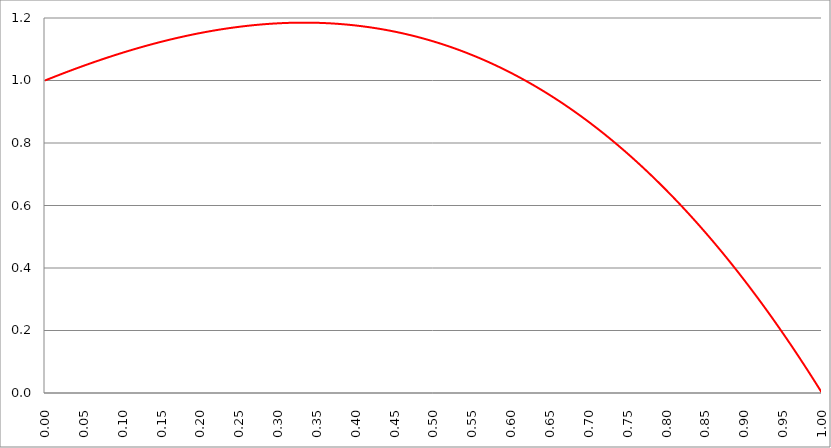
| Category | Series 1 | Series 0 | Series 2 |
|---|---|---|---|
| 0.0 | 1 |  |  |
| 0.0005 | 1 |  |  |
| 0.001 | 1.001 |  |  |
| 0.0015 | 1.001 |  |  |
| 0.002 | 1.002 |  |  |
| 0.0025 | 1.002 |  |  |
| 0.003 | 1.003 |  |  |
| 0.0035 | 1.003 |  |  |
| 0.004 | 1.004 |  |  |
| 0.0045 | 1.004 |  |  |
| 0.005 | 1.005 |  |  |
| 0.0055 | 1.005 |  |  |
| 0.006 | 1.006 |  |  |
| 0.0065 | 1.006 |  |  |
| 0.007 | 1.007 |  |  |
| 0.0075 | 1.007 |  |  |
| 0.008 | 1.008 |  |  |
| 0.0085 | 1.008 |  |  |
| 0.009 | 1.009 |  |  |
| 0.0095 | 1.009 |  |  |
| 0.01 | 1.01 |  |  |
| 0.0105 | 1.01 |  |  |
| 0.011 | 1.011 |  |  |
| 0.0115 | 1.011 |  |  |
| 0.012 | 1.012 |  |  |
| 0.0125 | 1.012 |  |  |
| 0.013 | 1.013 |  |  |
| 0.0135 | 1.013 |  |  |
| 0.014 | 1.014 |  |  |
| 0.0145 | 1.014 |  |  |
| 0.015 | 1.015 |  |  |
| 0.0155 | 1.015 |  |  |
| 0.016 | 1.016 |  |  |
| 0.0165 | 1.016 |  |  |
| 0.017 | 1.017 |  |  |
| 0.0175 | 1.017 |  |  |
| 0.018 | 1.018 |  |  |
| 0.0185 | 1.018 |  |  |
| 0.019 | 1.019 |  |  |
| 0.0195 | 1.019 |  |  |
| 0.02 | 1.02 |  |  |
| 0.0205 | 1.02 |  |  |
| 0.021 | 1.021 |  |  |
| 0.0215 | 1.021 |  |  |
| 0.022 | 1.022 |  |  |
| 0.0225 | 1.022 |  |  |
| 0.023 | 1.022 |  |  |
| 0.0235 | 1.023 |  |  |
| 0.024 | 1.023 |  |  |
| 0.0245 | 1.024 |  |  |
| 0.025 | 1.024 |  |  |
| 0.0255 | 1.025 |  |  |
| 0.026 | 1.025 |  |  |
| 0.0265 | 1.026 |  |  |
| 0.027 | 1.026 |  |  |
| 0.0275 | 1.027 |  |  |
| 0.028 | 1.027 |  |  |
| 0.0285 | 1.028 |  |  |
| 0.029 | 1.028 |  |  |
| 0.0295 | 1.029 |  |  |
| 0.03 | 1.029 |  |  |
| 0.0305 | 1.03 |  |  |
| 0.031 | 1.03 |  |  |
| 0.0315 | 1.03 |  |  |
| 0.032 | 1.031 |  |  |
| 0.0325 | 1.031 |  |  |
| 0.033 | 1.032 |  |  |
| 0.0335 | 1.032 |  |  |
| 0.034 | 1.033 |  |  |
| 0.0345 | 1.033 |  |  |
| 0.035 | 1.034 |  |  |
| 0.0355 | 1.034 |  |  |
| 0.036 | 1.035 |  |  |
| 0.0365 | 1.035 |  |  |
| 0.037 | 1.036 |  |  |
| 0.0375 | 1.036 |  |  |
| 0.038 | 1.037 |  |  |
| 0.0385 | 1.037 |  |  |
| 0.039 | 1.037 |  |  |
| 0.0395 | 1.038 |  |  |
| 0.04 | 1.038 |  |  |
| 0.0405 | 1.039 |  |  |
| 0.041 | 1.039 |  |  |
| 0.0415 | 1.04 |  |  |
| 0.042 | 1.04 |  |  |
| 0.0425 | 1.041 |  |  |
| 0.043 | 1.041 |  |  |
| 0.0435 | 1.042 |  |  |
| 0.044 | 1.042 |  |  |
| 0.0445 | 1.042 |  |  |
| 0.045 | 1.043 |  |  |
| 0.0455 | 1.043 |  |  |
| 0.046 | 1.044 |  |  |
| 0.0465 | 1.044 |  |  |
| 0.047 | 1.045 |  |  |
| 0.0475 | 1.045 |  |  |
| 0.048 | 1.046 |  |  |
| 0.0485 | 1.046 |  |  |
| 0.049 | 1.046 |  |  |
| 0.0495 | 1.047 |  |  |
| 0.05 | 1.047 |  |  |
| 0.0505 | 1.048 |  |  |
| 0.051 | 1.048 |  |  |
| 0.0515 | 1.049 |  |  |
| 0.052 | 1.049 |  |  |
| 0.0525 | 1.05 |  |  |
| 0.053 | 1.05 |  |  |
| 0.0535 | 1.05 |  |  |
| 0.054 | 1.051 |  |  |
| 0.0545 | 1.051 |  |  |
| 0.055 | 1.052 |  |  |
| 0.0555 | 1.052 |  |  |
| 0.056 | 1.053 |  |  |
| 0.0565 | 1.053 |  |  |
| 0.057 | 1.054 |  |  |
| 0.0575 | 1.054 |  |  |
| 0.058 | 1.054 |  |  |
| 0.0585 | 1.055 |  |  |
| 0.059 | 1.055 |  |  |
| 0.0595 | 1.056 |  |  |
| 0.06 | 1.056 |  |  |
| 0.0605 | 1.057 |  |  |
| 0.061 | 1.057 |  |  |
| 0.0615 | 1.057 |  |  |
| 0.062 | 1.058 |  |  |
| 0.0625 | 1.058 |  |  |
| 0.063 | 1.059 |  |  |
| 0.0635 | 1.059 |  |  |
| 0.064 | 1.06 |  |  |
| 0.0645 | 1.06 |  |  |
| 0.065 | 1.061 |  |  |
| 0.0655 | 1.061 |  |  |
| 0.066 | 1.061 |  |  |
| 0.0665 | 1.062 |  |  |
| 0.067 | 1.062 |  |  |
| 0.0675 | 1.063 |  |  |
| 0.068 | 1.063 |  |  |
| 0.0685 | 1.063 |  |  |
| 0.069 | 1.064 |  |  |
| 0.0695 | 1.064 |  |  |
| 0.07 | 1.065 |  |  |
| 0.0705 | 1.065 |  |  |
| 0.071 | 1.066 |  |  |
| 0.0715 | 1.066 |  |  |
| 0.072 | 1.066 |  |  |
| 0.0725 | 1.067 |  |  |
| 0.073 | 1.067 |  |  |
| 0.0735 | 1.068 |  |  |
| 0.074 | 1.068 |  |  |
| 0.0745 | 1.069 |  |  |
| 0.075 | 1.069 |  |  |
| 0.0755 | 1.069 |  |  |
| 0.076 | 1.07 |  |  |
| 0.0765 | 1.07 |  |  |
| 0.077 | 1.071 |  |  |
| 0.0775 | 1.071 |  |  |
| 0.078 | 1.071 |  |  |
| 0.0785 | 1.072 |  |  |
| 0.079 | 1.072 |  |  |
| 0.0795 | 1.073 |  |  |
| 0.08 | 1.073 |  |  |
| 0.0805 | 1.073 |  |  |
| 0.081 | 1.074 |  |  |
| 0.0815 | 1.074 |  |  |
| 0.082 | 1.075 |  |  |
| 0.0825 | 1.075 |  |  |
| 0.083 | 1.076 |  |  |
| 0.0835 | 1.076 |  |  |
| 0.084 | 1.076 |  |  |
| 0.0845 | 1.077 |  |  |
| 0.085 | 1.077 |  |  |
| 0.0855 | 1.078 |  |  |
| 0.086 | 1.078 |  |  |
| 0.0865 | 1.078 |  |  |
| 0.087 | 1.079 |  |  |
| 0.0875 | 1.079 |  |  |
| 0.088 | 1.08 |  |  |
| 0.0885 | 1.08 |  |  |
| 0.089 | 1.08 |  |  |
| 0.0895 | 1.081 |  |  |
| 0.09 | 1.081 |  |  |
| 0.0905 | 1.082 |  |  |
| 0.091 | 1.082 |  |  |
| 0.0915 | 1.082 |  |  |
| 0.092 | 1.083 |  |  |
| 0.0925 | 1.083 |  |  |
| 0.093 | 1.084 |  |  |
| 0.0935 | 1.084 |  |  |
| 0.094 | 1.084 |  |  |
| 0.0945 | 1.085 |  |  |
| 0.095 | 1.085 |  |  |
| 0.0955 | 1.086 |  |  |
| 0.096 | 1.086 |  |  |
| 0.0965 | 1.086 |  |  |
| 0.097 | 1.087 |  |  |
| 0.0975 | 1.087 |  |  |
| 0.098 | 1.087 |  |  |
| 0.0985 | 1.088 |  |  |
| 0.099 | 1.088 |  |  |
| 0.0995 | 1.089 |  |  |
| 0.1 | 1.089 |  |  |
| 0.1005 | 1.089 |  |  |
| 0.101 | 1.09 |  |  |
| 0.1015 | 1.09 |  |  |
| 0.102 | 1.091 |  |  |
| 0.1025 | 1.091 |  |  |
| 0.103 | 1.091 |  |  |
| 0.1035 | 1.092 |  |  |
| 0.104 | 1.092 |  |  |
| 0.1045 | 1.092 |  |  |
| 0.105 | 1.093 |  |  |
| 0.1055 | 1.093 |  |  |
| 0.106 | 1.094 |  |  |
| 0.1065 | 1.094 |  |  |
| 0.107 | 1.094 |  |  |
| 0.1075 | 1.095 |  |  |
| 0.108 | 1.095 |  |  |
| 0.1085 | 1.095 |  |  |
| 0.109 | 1.096 |  |  |
| 0.1095 | 1.096 |  |  |
| 0.11 | 1.097 |  |  |
| 0.1105 | 1.097 |  |  |
| 0.111 | 1.097 |  |  |
| 0.1115 | 1.098 |  |  |
| 0.112 | 1.098 |  |  |
| 0.1125 | 1.098 |  |  |
| 0.113 | 1.099 |  |  |
| 0.1135 | 1.099 |  |  |
| 0.114 | 1.1 |  |  |
| 0.1145 | 1.1 |  |  |
| 0.115 | 1.1 |  |  |
| 0.1155 | 1.101 |  |  |
| 0.116 | 1.101 |  |  |
| 0.1165 | 1.101 |  |  |
| 0.117 | 1.102 |  |  |
| 0.1175 | 1.102 |  |  |
| 0.118 | 1.102 |  |  |
| 0.1185 | 1.103 |  |  |
| 0.119 | 1.103 |  |  |
| 0.1195 | 1.104 |  |  |
| 0.12 | 1.104 |  |  |
| 0.1205 | 1.104 |  |  |
| 0.121 | 1.105 |  |  |
| 0.1215 | 1.105 |  |  |
| 0.122 | 1.105 |  |  |
| 0.1225 | 1.106 |  |  |
| 0.123 | 1.106 |  |  |
| 0.1235 | 1.106 |  |  |
| 0.124 | 1.107 |  |  |
| 0.1245 | 1.107 |  |  |
| 0.125 | 1.107 |  |  |
| 0.1255 | 1.108 |  |  |
| 0.126 | 1.108 |  |  |
| 0.1265 | 1.108 |  |  |
| 0.127 | 1.109 |  |  |
| 0.1275 | 1.109 |  |  |
| 0.128 | 1.11 |  |  |
| 0.1285 | 1.11 |  |  |
| 0.129 | 1.11 |  |  |
| 0.1295 | 1.111 |  |  |
| 0.13 | 1.111 |  |  |
| 0.1305 | 1.111 |  |  |
| 0.131 | 1.112 |  |  |
| 0.1315 | 1.112 |  |  |
| 0.132 | 1.112 |  |  |
| 0.1325 | 1.113 |  |  |
| 0.133 | 1.113 |  |  |
| 0.1335 | 1.113 |  |  |
| 0.134 | 1.114 |  |  |
| 0.1345 | 1.114 |  |  |
| 0.135 | 1.114 |  |  |
| 0.1355 | 1.115 |  |  |
| 0.136 | 1.115 |  |  |
| 0.1365 | 1.115 |  |  |
| 0.137 | 1.116 |  |  |
| 0.1375 | 1.116 |  |  |
| 0.138 | 1.116 |  |  |
| 0.1385 | 1.117 |  |  |
| 0.139 | 1.117 |  |  |
| 0.1395 | 1.117 |  |  |
| 0.14 | 1.118 |  |  |
| 0.1405 | 1.118 |  |  |
| 0.141 | 1.118 |  |  |
| 0.1415 | 1.119 |  |  |
| 0.142 | 1.119 |  |  |
| 0.1425 | 1.119 |  |  |
| 0.143 | 1.12 |  |  |
| 0.1435 | 1.12 |  |  |
| 0.144 | 1.12 |  |  |
| 0.1445 | 1.121 |  |  |
| 0.145 | 1.121 |  |  |
| 0.1455 | 1.121 |  |  |
| 0.146 | 1.122 |  |  |
| 0.1465 | 1.122 |  |  |
| 0.147 | 1.122 |  |  |
| 0.1475 | 1.123 |  |  |
| 0.148 | 1.123 |  |  |
| 0.1485 | 1.123 |  |  |
| 0.149 | 1.123 |  |  |
| 0.1495 | 1.124 |  |  |
| 0.15 | 1.124 |  |  |
| 0.1505 | 1.124 |  |  |
| 0.151 | 1.125 |  |  |
| 0.1515 | 1.125 |  |  |
| 0.152 | 1.125 |  |  |
| 0.1525 | 1.126 |  |  |
| 0.153 | 1.126 |  |  |
| 0.1535 | 1.126 |  |  |
| 0.154 | 1.127 |  |  |
| 0.1545 | 1.127 |  |  |
| 0.155 | 1.127 |  |  |
| 0.1555 | 1.128 |  |  |
| 0.156 | 1.128 |  |  |
| 0.1565 | 1.128 |  |  |
| 0.157 | 1.128 |  |  |
| 0.1575 | 1.129 |  |  |
| 0.158 | 1.129 |  |  |
| 0.1585 | 1.129 |  |  |
| 0.159 | 1.13 |  |  |
| 0.1595 | 1.13 |  |  |
| 0.16 | 1.13 |  |  |
| 0.1605 | 1.131 |  |  |
| 0.161 | 1.131 |  |  |
| 0.1615 | 1.131 |  |  |
| 0.162 | 1.132 |  |  |
| 0.1625 | 1.132 |  |  |
| 0.163 | 1.132 |  |  |
| 0.1635 | 1.132 |  |  |
| 0.164 | 1.133 |  |  |
| 0.1645 | 1.133 |  |  |
| 0.165 | 1.133 |  |  |
| 0.1655 | 1.134 |  |  |
| 0.166 | 1.134 |  |  |
| 0.1665 | 1.134 |  |  |
| 0.167 | 1.134 |  |  |
| 0.1675 | 1.135 |  |  |
| 0.168 | 1.135 |  |  |
| 0.1685 | 1.135 |  |  |
| 0.169 | 1.136 |  |  |
| 0.1695 | 1.136 |  |  |
| 0.17 | 1.136 |  |  |
| 0.1705 | 1.136 |  |  |
| 0.171 | 1.137 |  |  |
| 0.1715 | 1.137 |  |  |
| 0.172 | 1.137 |  |  |
| 0.1725 | 1.138 |  |  |
| 0.173 | 1.138 |  |  |
| 0.1735 | 1.138 |  |  |
| 0.174 | 1.138 |  |  |
| 0.1745 | 1.139 |  |  |
| 0.175 | 1.139 |  |  |
| 0.1755 | 1.139 |  |  |
| 0.176 | 1.14 |  |  |
| 0.1765 | 1.14 |  |  |
| 0.177 | 1.14 |  |  |
| 0.1775 | 1.14 |  |  |
| 0.178 | 1.141 |  |  |
| 0.1785 | 1.141 |  |  |
| 0.179 | 1.141 |  |  |
| 0.1795 | 1.141 |  |  |
| 0.18 | 1.142 |  |  |
| 0.1805 | 1.142 |  |  |
| 0.181 | 1.142 |  |  |
| 0.1815 | 1.143 |  |  |
| 0.182 | 1.143 |  |  |
| 0.1825 | 1.143 |  |  |
| 0.183 | 1.143 |  |  |
| 0.1835 | 1.144 |  |  |
| 0.184 | 1.144 |  |  |
| 0.1845 | 1.144 |  |  |
| 0.185 | 1.144 |  |  |
| 0.1855 | 1.145 |  |  |
| 0.186 | 1.145 |  |  |
| 0.1865 | 1.145 |  |  |
| 0.187 | 1.145 |  |  |
| 0.1875 | 1.146 |  |  |
| 0.188 | 1.146 |  |  |
| 0.1885 | 1.146 |  |  |
| 0.189 | 1.147 |  |  |
| 0.1895 | 1.147 |  |  |
| 0.19 | 1.147 |  |  |
| 0.1905 | 1.147 |  |  |
| 0.191 | 1.148 |  |  |
| 0.1915 | 1.148 |  |  |
| 0.192 | 1.148 |  |  |
| 0.1925 | 1.148 |  |  |
| 0.193 | 1.149 |  |  |
| 0.1935 | 1.149 |  |  |
| 0.194 | 1.149 |  |  |
| 0.1945 | 1.149 |  |  |
| 0.195 | 1.15 |  |  |
| 0.1955 | 1.15 |  |  |
| 0.196 | 1.15 |  |  |
| 0.1965 | 1.15 |  |  |
| 0.197 | 1.151 |  |  |
| 0.1975 | 1.151 |  |  |
| 0.198 | 1.151 |  |  |
| 0.1985 | 1.151 |  |  |
| 0.199 | 1.152 |  |  |
| 0.1995 | 1.152 |  |  |
| 0.2 | 1.152 |  |  |
| 0.2005 | 1.152 |  |  |
| 0.201 | 1.152 |  |  |
| 0.2015 | 1.153 |  |  |
| 0.202 | 1.153 |  |  |
| 0.2025 | 1.153 |  |  |
| 0.203 | 1.153 |  |  |
| 0.2035 | 1.154 |  |  |
| 0.204 | 1.154 |  |  |
| 0.2045 | 1.154 |  |  |
| 0.205 | 1.154 |  |  |
| 0.2055 | 1.155 |  |  |
| 0.206 | 1.155 |  |  |
| 0.2065 | 1.155 |  |  |
| 0.207 | 1.155 |  |  |
| 0.2075 | 1.156 |  |  |
| 0.208 | 1.156 |  |  |
| 0.2085 | 1.156 |  |  |
| 0.209 | 1.156 |  |  |
| 0.2095 | 1.156 |  |  |
| 0.21 | 1.157 |  |  |
| 0.2105 | 1.157 |  |  |
| 0.211 | 1.157 |  |  |
| 0.2115 | 1.157 |  |  |
| 0.212 | 1.158 |  |  |
| 0.2125 | 1.158 |  |  |
| 0.213 | 1.158 |  |  |
| 0.2135 | 1.158 |  |  |
| 0.214 | 1.158 |  |  |
| 0.2145 | 1.159 |  |  |
| 0.215 | 1.159 |  |  |
| 0.2155 | 1.159 |  |  |
| 0.216 | 1.159 |  |  |
| 0.2165 | 1.159 |  |  |
| 0.217 | 1.16 |  |  |
| 0.2175 | 1.16 |  |  |
| 0.218 | 1.16 |  |  |
| 0.2185 | 1.16 |  |  |
| 0.219 | 1.161 |  |  |
| 0.2195 | 1.161 |  |  |
| 0.22 | 1.161 |  |  |
| 0.2205 | 1.161 |  |  |
| 0.221 | 1.161 |  |  |
| 0.2215 | 1.162 |  |  |
| 0.222 | 1.162 |  |  |
| 0.2225 | 1.162 |  |  |
| 0.223 | 1.162 |  |  |
| 0.2235 | 1.162 |  |  |
| 0.224 | 1.163 |  |  |
| 0.2245 | 1.163 |  |  |
| 0.225 | 1.163 |  |  |
| 0.2255 | 1.163 |  |  |
| 0.226 | 1.163 |  |  |
| 0.2265 | 1.164 |  |  |
| 0.227 | 1.164 |  |  |
| 0.2275 | 1.164 |  |  |
| 0.228 | 1.164 |  |  |
| 0.2285 | 1.164 |  |  |
| 0.229 | 1.165 |  |  |
| 0.2295 | 1.165 |  |  |
| 0.23 | 1.165 |  |  |
| 0.2305 | 1.165 |  |  |
| 0.231 | 1.165 |  |  |
| 0.2315 | 1.166 |  |  |
| 0.232 | 1.166 |  |  |
| 0.2325 | 1.166 |  |  |
| 0.233 | 1.166 |  |  |
| 0.2335 | 1.166 |  |  |
| 0.234 | 1.166 |  |  |
| 0.2345 | 1.167 |  |  |
| 0.235 | 1.167 |  |  |
| 0.2355 | 1.167 |  |  |
| 0.236 | 1.167 |  |  |
| 0.2365 | 1.167 |  |  |
| 0.237 | 1.168 |  |  |
| 0.2375 | 1.168 |  |  |
| 0.238 | 1.168 |  |  |
| 0.2385 | 1.168 |  |  |
| 0.239 | 1.168 |  |  |
| 0.2395 | 1.168 |  |  |
| 0.24 | 1.169 |  |  |
| 0.2405 | 1.169 |  |  |
| 0.241 | 1.169 |  |  |
| 0.2415 | 1.169 |  |  |
| 0.242 | 1.169 |  |  |
| 0.2425 | 1.169 |  |  |
| 0.243 | 1.17 |  |  |
| 0.2435 | 1.17 |  |  |
| 0.244 | 1.17 |  |  |
| 0.2445 | 1.17 |  |  |
| 0.245 | 1.17 |  |  |
| 0.2455 | 1.17 |  |  |
| 0.246 | 1.171 |  |  |
| 0.2465 | 1.171 |  |  |
| 0.247 | 1.171 |  |  |
| 0.2475 | 1.171 |  |  |
| 0.248 | 1.171 |  |  |
| 0.2485 | 1.171 |  |  |
| 0.249 | 1.172 |  |  |
| 0.2495 | 1.172 |  |  |
| 0.25 | 1.172 |  |  |
| 0.2505 | 1.172 |  |  |
| 0.251 | 1.172 |  |  |
| 0.2515 | 1.172 |  |  |
| 0.252 | 1.172 |  |  |
| 0.2525 | 1.173 |  |  |
| 0.253 | 1.173 |  |  |
| 0.2535 | 1.173 |  |  |
| 0.254 | 1.173 |  |  |
| 0.2545 | 1.173 |  |  |
| 0.255 | 1.173 |  |  |
| 0.2555 | 1.174 |  |  |
| 0.256 | 1.174 |  |  |
| 0.2565 | 1.174 |  |  |
| 0.257 | 1.174 |  |  |
| 0.2575 | 1.174 |  |  |
| 0.258 | 1.174 |  |  |
| 0.2585 | 1.174 |  |  |
| 0.259 | 1.175 |  |  |
| 0.2595 | 1.175 |  |  |
| 0.26 | 1.175 |  |  |
| 0.2605 | 1.175 |  |  |
| 0.261 | 1.175 |  |  |
| 0.2615 | 1.175 |  |  |
| 0.262 | 1.175 |  |  |
| 0.2625 | 1.176 |  |  |
| 0.263 | 1.176 |  |  |
| 0.2635 | 1.176 |  |  |
| 0.264 | 1.176 |  |  |
| 0.2645 | 1.176 |  |  |
| 0.265 | 1.176 |  |  |
| 0.2655 | 1.176 |  |  |
| 0.266 | 1.176 |  |  |
| 0.2665 | 1.177 |  |  |
| 0.267 | 1.177 |  |  |
| 0.2675 | 1.177 |  |  |
| 0.268 | 1.177 |  |  |
| 0.2685 | 1.177 |  |  |
| 0.269 | 1.177 |  |  |
| 0.2695 | 1.177 |  |  |
| 0.27 | 1.177 |  |  |
| 0.2705 | 1.178 |  |  |
| 0.271 | 1.178 |  |  |
| 0.2715 | 1.178 |  |  |
| 0.272 | 1.178 |  |  |
| 0.2725 | 1.178 |  |  |
| 0.273 | 1.178 |  |  |
| 0.2735 | 1.178 |  |  |
| 0.274 | 1.178 |  |  |
| 0.2745 | 1.178 |  |  |
| 0.275 | 1.179 |  |  |
| 0.2755 | 1.179 |  |  |
| 0.276 | 1.179 |  |  |
| 0.2765 | 1.179 |  |  |
| 0.277 | 1.179 |  |  |
| 0.2775 | 1.179 |  |  |
| 0.278 | 1.179 |  |  |
| 0.2785 | 1.179 |  |  |
| 0.279 | 1.179 |  |  |
| 0.2795 | 1.18 |  |  |
| 0.28 | 1.18 |  |  |
| 0.2805 | 1.18 |  |  |
| 0.281 | 1.18 |  |  |
| 0.2815 | 1.18 |  |  |
| 0.282 | 1.18 |  |  |
| 0.2825 | 1.18 |  |  |
| 0.283 | 1.18 |  |  |
| 0.2835 | 1.18 |  |  |
| 0.284 | 1.18 |  |  |
| 0.2845 | 1.181 |  |  |
| 0.285 | 1.181 |  |  |
| 0.2855 | 1.181 |  |  |
| 0.286 | 1.181 |  |  |
| 0.2865 | 1.181 |  |  |
| 0.287 | 1.181 |  |  |
| 0.2875 | 1.181 |  |  |
| 0.288 | 1.181 |  |  |
| 0.2885 | 1.181 |  |  |
| 0.289 | 1.181 |  |  |
| 0.2895 | 1.181 |  |  |
| 0.29 | 1.182 |  |  |
| 0.2905 | 1.182 |  |  |
| 0.291 | 1.182 |  |  |
| 0.2915 | 1.182 |  |  |
| 0.292 | 1.182 |  |  |
| 0.2925 | 1.182 |  |  |
| 0.293 | 1.182 |  |  |
| 0.2935 | 1.182 |  |  |
| 0.294 | 1.182 |  |  |
| 0.2945 | 1.182 |  |  |
| 0.295 | 1.182 |  |  |
| 0.2955 | 1.182 |  |  |
| 0.296 | 1.182 |  |  |
| 0.2965 | 1.183 |  |  |
| 0.297 | 1.183 |  |  |
| 0.2975 | 1.183 |  |  |
| 0.298 | 1.183 |  |  |
| 0.2985 | 1.183 |  |  |
| 0.299 | 1.183 |  |  |
| 0.2995 | 1.183 |  |  |
| 0.3 | 1.183 |  |  |
| 0.3005 | 1.183 |  |  |
| 0.301 | 1.183 |  |  |
| 0.3015 | 1.183 |  |  |
| 0.302 | 1.183 |  |  |
| 0.3025 | 1.183 |  |  |
| 0.303 | 1.183 |  |  |
| 0.3035 | 1.183 |  |  |
| 0.304 | 1.183 |  |  |
| 0.3045 | 1.184 |  |  |
| 0.305 | 1.184 |  |  |
| 0.3055 | 1.184 |  |  |
| 0.306 | 1.184 |  |  |
| 0.3065 | 1.184 |  |  |
| 0.307 | 1.184 |  |  |
| 0.3075 | 1.184 |  |  |
| 0.308 | 1.184 |  |  |
| 0.3085 | 1.184 |  |  |
| 0.309 | 1.184 |  |  |
| 0.3095 | 1.184 |  |  |
| 0.31 | 1.184 |  |  |
| 0.3105 | 1.184 |  |  |
| 0.311 | 1.184 |  |  |
| 0.3115 | 1.184 |  |  |
| 0.312 | 1.184 |  |  |
| 0.3125 | 1.184 |  |  |
| 0.313 | 1.184 |  |  |
| 0.3135 | 1.184 |  |  |
| 0.314 | 1.184 |  |  |
| 0.3145 | 1.184 |  |  |
| 0.315 | 1.185 |  |  |
| 0.3155 | 1.185 |  |  |
| 0.316 | 1.185 |  |  |
| 0.3165 | 1.185 |  |  |
| 0.317 | 1.185 |  |  |
| 0.3175 | 1.185 |  |  |
| 0.318 | 1.185 |  |  |
| 0.3185 | 1.185 |  |  |
| 0.319 | 1.185 |  |  |
| 0.3195 | 1.185 |  |  |
| 0.32 | 1.185 |  |  |
| 0.3205 | 1.185 |  |  |
| 0.321 | 1.185 |  |  |
| 0.3215 | 1.185 |  |  |
| 0.322 | 1.185 |  |  |
| 0.3225 | 1.185 |  |  |
| 0.323 | 1.185 |  |  |
| 0.3235 | 1.185 |  |  |
| 0.324 | 1.185 |  |  |
| 0.3245 | 1.185 |  |  |
| 0.325 | 1.185 |  |  |
| 0.3255 | 1.185 |  |  |
| 0.326 | 1.185 |  |  |
| 0.3265 | 1.185 |  |  |
| 0.327 | 1.185 |  |  |
| 0.3275 | 1.185 |  |  |
| 0.328 | 1.185 |  |  |
| 0.3285 | 1.185 |  |  |
| 0.329 | 1.185 |  |  |
| 0.3295 | 1.185 |  |  |
| 0.33 | 1.185 |  |  |
| 0.3305 | 1.185 |  |  |
| 0.331 | 1.185 |  |  |
| 0.3315 | 1.185 |  |  |
| 0.332 | 1.185 |  |  |
| 0.3325 | 1.185 |  |  |
| 0.333 | 1.185 |  |  |
| 0.3335 | 1.185 |  |  |
| 0.334 | 1.185 |  |  |
| 0.3345 | 1.185 |  |  |
| 0.335 | 1.185 |  |  |
| 0.3355 | 1.185 |  |  |
| 0.336 | 1.185 |  |  |
| 0.3365 | 1.185 |  |  |
| 0.337 | 1.185 |  |  |
| 0.3375 | 1.185 |  |  |
| 0.338 | 1.185 |  |  |
| 0.3385 | 1.185 |  |  |
| 0.339 | 1.185 |  |  |
| 0.3395 | 1.185 |  |  |
| 0.34 | 1.185 |  |  |
| 0.3405 | 1.185 |  |  |
| 0.341 | 1.185 |  |  |
| 0.3415 | 1.185 |  |  |
| 0.342 | 1.185 |  |  |
| 0.3425 | 1.185 |  |  |
| 0.343 | 1.185 |  |  |
| 0.3435 | 1.185 |  |  |
| 0.344 | 1.185 |  |  |
| 0.3445 | 1.185 |  |  |
| 0.345 | 1.185 |  |  |
| 0.3455 | 1.185 |  |  |
| 0.346 | 1.185 |  |  |
| 0.3465 | 1.185 |  |  |
| 0.347 | 1.185 |  |  |
| 0.3475 | 1.185 |  |  |
| 0.348 | 1.185 |  |  |
| 0.3485 | 1.185 |  |  |
| 0.349 | 1.185 |  |  |
| 0.3495 | 1.185 |  |  |
| 0.35 | 1.185 |  |  |
| 0.3505 | 1.185 |  |  |
| 0.351 | 1.185 |  |  |
| 0.3515 | 1.185 |  |  |
| 0.352 | 1.184 |  |  |
| 0.3525 | 1.184 |  |  |
| 0.353 | 1.184 |  |  |
| 0.3535 | 1.184 |  |  |
| 0.354 | 1.184 |  |  |
| 0.3545 | 1.184 |  |  |
| 0.355 | 1.184 |  |  |
| 0.3555 | 1.184 |  |  |
| 0.356 | 1.184 |  |  |
| 0.3565 | 1.184 |  |  |
| 0.357 | 1.184 |  |  |
| 0.3575 | 1.184 |  |  |
| 0.358 | 1.184 |  |  |
| 0.3585 | 1.184 |  |  |
| 0.359 | 1.184 |  |  |
| 0.3595 | 1.184 |  |  |
| 0.36 | 1.184 |  |  |
| 0.3605 | 1.184 |  |  |
| 0.361 | 1.184 |  |  |
| 0.3615 | 1.184 |  |  |
| 0.362 | 1.184 |  |  |
| 0.3625 | 1.183 |  |  |
| 0.363 | 1.183 |  |  |
| 0.3635 | 1.183 |  |  |
| 0.364 | 1.183 |  |  |
| 0.3645 | 1.183 |  |  |
| 0.365 | 1.183 |  |  |
| 0.3655 | 1.183 |  |  |
| 0.366 | 1.183 |  |  |
| 0.3665 | 1.183 |  |  |
| 0.367 | 1.183 |  |  |
| 0.3675 | 1.183 |  |  |
| 0.368 | 1.183 |  |  |
| 0.3685 | 1.183 |  |  |
| 0.369 | 1.183 |  |  |
| 0.3695 | 1.183 |  |  |
| 0.37 | 1.182 |  |  |
| 0.3705 | 1.182 |  |  |
| 0.371 | 1.182 |  |  |
| 0.3715 | 1.182 |  |  |
| 0.372 | 1.182 |  |  |
| 0.3725 | 1.182 |  |  |
| 0.373 | 1.182 |  |  |
| 0.3735 | 1.182 |  |  |
| 0.374 | 1.182 |  |  |
| 0.3745 | 1.182 |  |  |
| 0.375 | 1.182 |  |  |
| 0.3755 | 1.182 |  |  |
| 0.376 | 1.181 |  |  |
| 0.3765 | 1.181 |  |  |
| 0.377 | 1.181 |  |  |
| 0.3775 | 1.181 |  |  |
| 0.378 | 1.181 |  |  |
| 0.3785 | 1.181 |  |  |
| 0.379 | 1.181 |  |  |
| 0.3795 | 1.181 |  |  |
| 0.38 | 1.181 |  |  |
| 0.3805 | 1.181 |  |  |
| 0.381 | 1.181 |  |  |
| 0.3815 | 1.18 |  |  |
| 0.382 | 1.18 |  |  |
| 0.3825 | 1.18 |  |  |
| 0.383 | 1.18 |  |  |
| 0.3835 | 1.18 |  |  |
| 0.384 | 1.18 |  |  |
| 0.3845 | 1.18 |  |  |
| 0.385 | 1.18 |  |  |
| 0.3855 | 1.18 |  |  |
| 0.386 | 1.179 |  |  |
| 0.3865 | 1.179 |  |  |
| 0.387 | 1.179 |  |  |
| 0.3875 | 1.179 |  |  |
| 0.388 | 1.179 |  |  |
| 0.3885 | 1.179 |  |  |
| 0.389 | 1.179 |  |  |
| 0.3895 | 1.179 |  |  |
| 0.39 | 1.179 |  |  |
| 0.3905 | 1.178 |  |  |
| 0.391 | 1.178 |  |  |
| 0.3915 | 1.178 |  |  |
| 0.392 | 1.178 |  |  |
| 0.3925 | 1.178 |  |  |
| 0.393 | 1.178 |  |  |
| 0.3935 | 1.178 |  |  |
| 0.394 | 1.178 |  |  |
| 0.3945 | 1.177 |  |  |
| 0.395 | 1.177 |  |  |
| 0.3955 | 1.177 |  |  |
| 0.396 | 1.177 |  |  |
| 0.3965 | 1.177 |  |  |
| 0.397 | 1.177 |  |  |
| 0.3975 | 1.177 |  |  |
| 0.398 | 1.177 |  |  |
| 0.3985 | 1.176 |  |  |
| 0.399 | 1.176 |  |  |
| 0.3995 | 1.176 |  |  |
| 0.4 | 1.176 |  |  |
| 0.4005 | 1.176 |  |  |
| 0.401 | 1.176 |  |  |
| 0.4015 | 1.176 |  |  |
| 0.402 | 1.175 |  |  |
| 0.4025 | 1.175 |  |  |
| 0.403 | 1.175 |  |  |
| 0.4035 | 1.175 |  |  |
| 0.404 | 1.175 |  |  |
| 0.4045 | 1.175 |  |  |
| 0.405 | 1.175 |  |  |
| 0.4055 | 1.174 |  |  |
| 0.406 | 1.174 |  |  |
| 0.4065 | 1.174 |  |  |
| 0.407 | 1.174 |  |  |
| 0.4075 | 1.174 |  |  |
| 0.408 | 1.174 |  |  |
| 0.4085 | 1.173 |  |  |
| 0.409 | 1.173 |  |  |
| 0.4095 | 1.173 |  |  |
| 0.41 | 1.173 |  |  |
| 0.4105 | 1.173 |  |  |
| 0.411 | 1.173 |  |  |
| 0.4115 | 1.172 |  |  |
| 0.412 | 1.172 |  |  |
| 0.4125 | 1.172 |  |  |
| 0.413 | 1.172 |  |  |
| 0.4135 | 1.172 |  |  |
| 0.414 | 1.172 |  |  |
| 0.4145 | 1.171 |  |  |
| 0.415 | 1.171 |  |  |
| 0.4155 | 1.171 |  |  |
| 0.416 | 1.171 |  |  |
| 0.4165 | 1.171 |  |  |
| 0.417 | 1.171 |  |  |
| 0.4175 | 1.17 |  |  |
| 0.418 | 1.17 |  |  |
| 0.4185 | 1.17 |  |  |
| 0.419 | 1.17 |  |  |
| 0.4195 | 1.17 |  |  |
| 0.42 | 1.17 |  |  |
| 0.4205 | 1.169 |  |  |
| 0.421 | 1.169 |  |  |
| 0.4215 | 1.169 |  |  |
| 0.422 | 1.169 |  |  |
| 0.4225 | 1.169 |  |  |
| 0.423 | 1.168 |  |  |
| 0.4235 | 1.168 |  |  |
| 0.424 | 1.168 |  |  |
| 0.4245 | 1.168 |  |  |
| 0.425 | 1.168 |  |  |
| 0.4255 | 1.167 |  |  |
| 0.426 | 1.167 |  |  |
| 0.4265 | 1.167 |  |  |
| 0.427 | 1.167 |  |  |
| 0.4275 | 1.167 |  |  |
| 0.428 | 1.166 |  |  |
| 0.4285 | 1.166 |  |  |
| 0.429 | 1.166 |  |  |
| 0.4295 | 1.166 |  |  |
| 0.43 | 1.166 |  |  |
| 0.4305 | 1.165 |  |  |
| 0.431 | 1.165 |  |  |
| 0.4315 | 1.165 |  |  |
| 0.432 | 1.165 |  |  |
| 0.4325 | 1.165 |  |  |
| 0.433 | 1.164 |  |  |
| 0.4335 | 1.164 |  |  |
| 0.434 | 1.164 |  |  |
| 0.4345 | 1.164 |  |  |
| 0.435 | 1.163 |  |  |
| 0.4355 | 1.163 |  |  |
| 0.436 | 1.163 |  |  |
| 0.4365 | 1.163 |  |  |
| 0.437 | 1.163 |  |  |
| 0.4375 | 1.162 |  |  |
| 0.438 | 1.162 |  |  |
| 0.4385 | 1.162 |  |  |
| 0.439 | 1.162 |  |  |
| 0.4395 | 1.161 |  |  |
| 0.44 | 1.161 |  |  |
| 0.4405 | 1.161 |  |  |
| 0.441 | 1.161 |  |  |
| 0.4415 | 1.161 |  |  |
| 0.442 | 1.16 |  |  |
| 0.4425 | 1.16 |  |  |
| 0.443 | 1.16 |  |  |
| 0.4435 | 1.16 |  |  |
| 0.444 | 1.159 |  |  |
| 0.4445 | 1.159 |  |  |
| 0.445 | 1.159 |  |  |
| 0.4455 | 1.159 |  |  |
| 0.446 | 1.158 |  |  |
| 0.4465 | 1.158 |  |  |
| 0.447 | 1.158 |  |  |
| 0.4475 | 1.158 |  |  |
| 0.448 | 1.157 |  |  |
| 0.4485 | 1.157 |  |  |
| 0.449 | 1.157 |  |  |
| 0.4495 | 1.157 |  |  |
| 0.45 | 1.156 |  |  |
| 0.4505 | 1.156 |  |  |
| 0.451 | 1.156 |  |  |
| 0.4515 | 1.156 |  |  |
| 0.452 | 1.155 |  |  |
| 0.4525 | 1.155 |  |  |
| 0.453 | 1.155 |  |  |
| 0.4535 | 1.155 |  |  |
| 0.454 | 1.154 |  |  |
| 0.4545 | 1.154 |  |  |
| 0.455 | 1.154 |  |  |
| 0.4555 | 1.154 |  |  |
| 0.456 | 1.153 |  |  |
| 0.4565 | 1.153 |  |  |
| 0.457 | 1.153 |  |  |
| 0.4575 | 1.152 |  |  |
| 0.458 | 1.152 |  |  |
| 0.4585 | 1.152 |  |  |
| 0.459 | 1.152 |  |  |
| 0.4595 | 1.151 |  |  |
| 0.46 | 1.151 |  |  |
| 0.4605 | 1.151 |  |  |
| 0.461 | 1.151 |  |  |
| 0.4615 | 1.15 |  |  |
| 0.462 | 1.15 |  |  |
| 0.4625 | 1.15 |  |  |
| 0.463 | 1.149 |  |  |
| 0.4635 | 1.149 |  |  |
| 0.464 | 1.149 |  |  |
| 0.4645 | 1.149 |  |  |
| 0.465 | 1.148 |  |  |
| 0.4655 | 1.148 |  |  |
| 0.466 | 1.148 |  |  |
| 0.4665 | 1.147 |  |  |
| 0.467 | 1.147 |  |  |
| 0.4675 | 1.147 |  |  |
| 0.468 | 1.146 |  |  |
| 0.4685 | 1.146 |  |  |
| 0.469 | 1.146 |  |  |
| 0.4695 | 1.146 |  |  |
| 0.47 | 1.145 |  |  |
| 0.4705 | 1.145 |  |  |
| 0.471 | 1.145 |  |  |
| 0.4715 | 1.144 |  |  |
| 0.472 | 1.144 |  |  |
| 0.4725 | 1.144 |  |  |
| 0.473 | 1.143 |  |  |
| 0.4735 | 1.143 |  |  |
| 0.474 | 1.143 |  |  |
| 0.4745 | 1.143 |  |  |
| 0.475 | 1.142 |  |  |
| 0.4755 | 1.142 |  |  |
| 0.476 | 1.142 |  |  |
| 0.4765 | 1.141 |  |  |
| 0.477 | 1.141 |  |  |
| 0.4775 | 1.141 |  |  |
| 0.478 | 1.14 |  |  |
| 0.4785 | 1.14 |  |  |
| 0.479 | 1.14 |  |  |
| 0.4795 | 1.139 |  |  |
| 0.48 | 1.139 |  |  |
| 0.4805 | 1.139 |  |  |
| 0.481 | 1.138 |  |  |
| 0.4815 | 1.138 |  |  |
| 0.482 | 1.138 |  |  |
| 0.4825 | 1.137 |  |  |
| 0.483 | 1.137 |  |  |
| 0.4835 | 1.137 |  |  |
| 0.484 | 1.136 |  |  |
| 0.4845 | 1.136 |  |  |
| 0.485 | 1.136 |  |  |
| 0.4855 | 1.135 |  |  |
| 0.486 | 1.135 |  |  |
| 0.4865 | 1.135 |  |  |
| 0.487 | 1.134 |  |  |
| 0.4875 | 1.134 |  |  |
| 0.488 | 1.134 |  |  |
| 0.4885 | 1.133 |  |  |
| 0.489 | 1.133 |  |  |
| 0.4895 | 1.133 |  |  |
| 0.49 | 1.132 |  |  |
| 0.4905 | 1.132 |  |  |
| 0.491 | 1.132 |  |  |
| 0.4915 | 1.131 |  |  |
| 0.492 | 1.131 |  |  |
| 0.4925 | 1.13 |  |  |
| 0.493 | 1.13 |  |  |
| 0.4935 | 1.13 |  |  |
| 0.494 | 1.129 |  |  |
| 0.4945 | 1.129 |  |  |
| 0.495 | 1.129 |  |  |
| 0.4955 | 1.128 |  |  |
| 0.496 | 1.128 |  |  |
| 0.4965 | 1.128 |  |  |
| 0.497 | 1.127 |  |  |
| 0.4975 | 1.127 |  |  |
| 0.498 | 1.126 |  |  |
| 0.4985 | 1.126 |  |  |
| 0.499 | 1.126 |  |  |
| 0.4995 | 1.125 |  |  |
| 0.5 | 1.125 |  |  |
| 0.5005 | 1.125 |  |  |
| 0.501 | 1.124 |  |  |
| 0.5015 | 1.124 |  |  |
| 0.502 | 1.123 |  |  |
| 0.5025 | 1.123 |  |  |
| 0.503 | 1.123 |  |  |
| 0.5035 | 1.122 |  |  |
| 0.504 | 1.122 |  |  |
| 0.5045 | 1.122 |  |  |
| 0.505 | 1.121 |  |  |
| 0.5055 | 1.121 |  |  |
| 0.506 | 1.12 |  |  |
| 0.5065 | 1.12 |  |  |
| 0.507 | 1.12 |  |  |
| 0.5075 | 1.119 |  |  |
| 0.507999999999999 | 1.119 |  |  |
| 0.508499999999999 | 1.118 |  |  |
| 0.508999999999999 | 1.118 |  |  |
| 0.509499999999999 | 1.118 |  |  |
| 0.509999999999999 | 1.117 |  |  |
| 0.510499999999999 | 1.117 |  |  |
| 0.510999999999999 | 1.116 |  |  |
| 0.511499999999999 | 1.116 |  |  |
| 0.511999999999999 | 1.116 |  |  |
| 0.512499999999999 | 1.115 |  |  |
| 0.512999999999999 | 1.115 |  |  |
| 0.513499999999999 | 1.114 |  |  |
| 0.513999999999999 | 1.114 |  |  |
| 0.514499999999999 | 1.114 |  |  |
| 0.514999999999999 | 1.113 |  |  |
| 0.515499999999999 | 1.113 |  |  |
| 0.515999999999999 | 1.112 |  |  |
| 0.516499999999999 | 1.112 |  |  |
| 0.516999999999998 | 1.112 |  |  |
| 0.517499999999998 | 1.111 |  |  |
| 0.517999999999998 | 1.111 |  |  |
| 0.518499999999998 | 1.11 |  |  |
| 0.518999999999998 | 1.11 |  |  |
| 0.519499999999998 | 1.109 |  |  |
| 0.519999999999998 | 1.109 |  |  |
| 0.520499999999998 | 1.109 |  |  |
| 0.520999999999998 | 1.108 |  |  |
| 0.521499999999998 | 1.108 |  |  |
| 0.521999999999998 | 1.107 |  |  |
| 0.522499999999998 | 1.107 |  |  |
| 0.522999999999998 | 1.106 |  |  |
| 0.523499999999998 | 1.106 |  |  |
| 0.523999999999998 | 1.106 |  |  |
| 0.524499999999998 | 1.105 |  |  |
| 0.524999999999998 | 1.105 |  |  |
| 0.525499999999998 | 1.104 |  |  |
| 0.525999999999997 | 1.104 |  |  |
| 0.526499999999997 | 1.103 |  |  |
| 0.526999999999997 | 1.103 |  |  |
| 0.527499999999997 | 1.102 |  |  |
| 0.527999999999997 | 1.102 |  |  |
| 0.528499999999997 | 1.102 |  |  |
| 0.528999999999997 | 1.101 |  |  |
| 0.529499999999997 | 1.101 |  |  |
| 0.529999999999997 | 1.1 |  |  |
| 0.530499999999997 | 1.1 |  |  |
| 0.530999999999997 | 1.099 |  |  |
| 0.531499999999997 | 1.099 |  |  |
| 0.531999999999997 | 1.098 |  |  |
| 0.532499999999997 | 1.098 |  |  |
| 0.532999999999997 | 1.097 |  |  |
| 0.533499999999997 | 1.097 |  |  |
| 0.533999999999997 | 1.097 |  |  |
| 0.534499999999997 | 1.096 |  |  |
| 0.534999999999996 | 1.096 |  |  |
| 0.535499999999996 | 1.095 |  |  |
| 0.535999999999996 | 1.095 |  |  |
| 0.536499999999996 | 1.094 |  |  |
| 0.536999999999996 | 1.094 |  |  |
| 0.537499999999996 | 1.093 |  |  |
| 0.537999999999996 | 1.093 |  |  |
| 0.538499999999996 | 1.092 |  |  |
| 0.538999999999996 | 1.092 |  |  |
| 0.539499999999996 | 1.091 |  |  |
| 0.539999999999996 | 1.091 |  |  |
| 0.540499999999996 | 1.09 |  |  |
| 0.540999999999996 | 1.09 |  |  |
| 0.541499999999996 | 1.089 |  |  |
| 0.541999999999996 | 1.089 |  |  |
| 0.542499999999996 | 1.089 |  |  |
| 0.542999999999996 | 1.088 |  |  |
| 0.543499999999996 | 1.088 |  |  |
| 0.543999999999995 | 1.087 |  |  |
| 0.544499999999995 | 1.087 |  |  |
| 0.544999999999995 | 1.086 |  |  |
| 0.545499999999995 | 1.086 |  |  |
| 0.545999999999995 | 1.085 |  |  |
| 0.546499999999995 | 1.085 |  |  |
| 0.546999999999995 | 1.084 |  |  |
| 0.547499999999995 | 1.084 |  |  |
| 0.547999999999995 | 1.083 |  |  |
| 0.548499999999995 | 1.083 |  |  |
| 0.548999999999995 | 1.082 |  |  |
| 0.549499999999995 | 1.082 |  |  |
| 0.549999999999995 | 1.081 |  |  |
| 0.550499999999995 | 1.081 |  |  |
| 0.550999999999995 | 1.08 |  |  |
| 0.551499999999995 | 1.08 |  |  |
| 0.551999999999995 | 1.079 |  |  |
| 0.552499999999995 | 1.079 |  |  |
| 0.552999999999994 | 1.078 |  |  |
| 0.553499999999994 | 1.078 |  |  |
| 0.553999999999994 | 1.077 |  |  |
| 0.554499999999994 | 1.077 |  |  |
| 0.554999999999994 | 1.076 |  |  |
| 0.555499999999994 | 1.076 |  |  |
| 0.555999999999994 | 1.075 |  |  |
| 0.556499999999994 | 1.074 |  |  |
| 0.556999999999994 | 1.074 |  |  |
| 0.557499999999994 | 1.073 |  |  |
| 0.557999999999994 | 1.073 |  |  |
| 0.558499999999994 | 1.072 |  |  |
| 0.558999999999994 | 1.072 |  |  |
| 0.559499999999994 | 1.071 |  |  |
| 0.559999999999994 | 1.071 |  |  |
| 0.560499999999994 | 1.07 |  |  |
| 0.560999999999994 | 1.07 |  |  |
| 0.561499999999994 | 1.069 |  |  |
| 0.561999999999993 | 1.069 |  |  |
| 0.562499999999993 | 1.068 |  |  |
| 0.562999999999993 | 1.068 |  |  |
| 0.563499999999993 | 1.067 |  |  |
| 0.563999999999993 | 1.066 |  |  |
| 0.564499999999993 | 1.066 |  |  |
| 0.564999999999993 | 1.065 |  |  |
| 0.565499999999993 | 1.065 |  |  |
| 0.565999999999993 | 1.064 |  |  |
| 0.566499999999993 | 1.064 |  |  |
| 0.566999999999993 | 1.063 |  |  |
| 0.567499999999993 | 1.063 |  |  |
| 0.567999999999993 | 1.062 |  |  |
| 0.568499999999993 | 1.062 |  |  |
| 0.568999999999993 | 1.061 |  |  |
| 0.569499999999993 | 1.06 |  |  |
| 0.569999999999993 | 1.06 |  |  |
| 0.570499999999993 | 1.059 |  |  |
| 0.570999999999993 | 1.059 |  |  |
| 0.571499999999992 | 1.058 |  |  |
| 0.571999999999992 | 1.058 |  |  |
| 0.572499999999992 | 1.057 |  |  |
| 0.572999999999992 | 1.057 |  |  |
| 0.573499999999992 | 1.056 |  |  |
| 0.573999999999992 | 1.055 |  |  |
| 0.574499999999992 | 1.055 |  |  |
| 0.574999999999992 | 1.054 |  |  |
| 0.575499999999992 | 1.054 |  |  |
| 0.575999999999992 | 1.053 |  |  |
| 0.576499999999992 | 1.053 |  |  |
| 0.576999999999992 | 1.052 |  |  |
| 0.577499999999992 | 1.051 |  |  |
| 0.577999999999992 | 1.051 |  |  |
| 0.578499999999992 | 1.05 |  |  |
| 0.578999999999992 | 1.05 |  |  |
| 0.579499999999992 | 1.049 |  |  |
| 0.579999999999992 | 1.048 |  |  |
| 0.580499999999991 | 1.048 |  |  |
| 0.580999999999991 | 1.047 |  |  |
| 0.581499999999991 | 1.047 |  |  |
| 0.581999999999991 | 1.046 |  |  |
| 0.582499999999991 | 1.046 |  |  |
| 0.582999999999991 | 1.045 |  |  |
| 0.583499999999991 | 1.044 |  |  |
| 0.583999999999991 | 1.044 |  |  |
| 0.584499999999991 | 1.043 |  |  |
| 0.584999999999991 | 1.043 |  |  |
| 0.585499999999991 | 1.042 |  |  |
| 0.585999999999991 | 1.041 |  |  |
| 0.586499999999991 | 1.041 |  |  |
| 0.586999999999991 | 1.04 |  |  |
| 0.587499999999991 | 1.04 |  |  |
| 0.587999999999991 | 1.039 |  |  |
| 0.588499999999991 | 1.038 |  |  |
| 0.588999999999991 | 1.038 |  |  |
| 0.58949999999999 | 1.037 |  |  |
| 0.58999999999999 | 1.037 |  |  |
| 0.59049999999999 | 1.036 |  |  |
| 0.59099999999999 | 1.035 |  |  |
| 0.59149999999999 | 1.035 |  |  |
| 0.59199999999999 | 1.034 |  |  |
| 0.59249999999999 | 1.033 |  |  |
| 0.59299999999999 | 1.033 |  |  |
| 0.59349999999999 | 1.032 |  |  |
| 0.59399999999999 | 1.032 |  |  |
| 0.59449999999999 | 1.031 |  |  |
| 0.59499999999999 | 1.03 |  |  |
| 0.59549999999999 | 1.03 |  |  |
| 0.59599999999999 | 1.029 |  |  |
| 0.59649999999999 | 1.028 |  |  |
| 0.59699999999999 | 1.028 |  |  |
| 0.59749999999999 | 1.027 |  |  |
| 0.59799999999999 | 1.027 |  |  |
| 0.598499999999989 | 1.026 |  |  |
| 0.598999999999989 | 1.025 |  |  |
| 0.599499999999989 | 1.025 |  |  |
| 0.599999999999989 | 1.024 |  |  |
| 0.600499999999989 | 1.023 |  |  |
| 0.600999999999989 | 1.023 |  |  |
| 0.601499999999989 | 1.022 |  |  |
| 0.601999999999989 | 1.021 |  |  |
| 0.602499999999989 | 1.021 |  |  |
| 0.602999999999989 | 1.02 |  |  |
| 0.603499999999989 | 1.019 |  |  |
| 0.603999999999989 | 1.019 |  |  |
| 0.604499999999989 | 1.018 |  |  |
| 0.604999999999989 | 1.018 |  |  |
| 0.605499999999989 | 1.017 |  |  |
| 0.605999999999989 | 1.016 |  |  |
| 0.606499999999989 | 1.016 |  |  |
| 0.606999999999988 | 1.015 |  |  |
| 0.607499999999988 | 1.014 |  |  |
| 0.607999999999988 | 1.014 |  |  |
| 0.608499999999988 | 1.013 |  |  |
| 0.608999999999988 | 1.012 |  |  |
| 0.609499999999988 | 1.012 |  |  |
| 0.609999999999988 | 1.011 |  |  |
| 0.610499999999988 | 1.01 |  |  |
| 0.610999999999988 | 1.01 |  |  |
| 0.611499999999988 | 1.009 |  |  |
| 0.611999999999988 | 1.008 |  |  |
| 0.612499999999988 | 1.008 |  |  |
| 0.612999999999988 | 1.007 |  |  |
| 0.613499999999988 | 1.006 |  |  |
| 0.613999999999988 | 1.006 |  |  |
| 0.614499999999988 | 1.005 |  |  |
| 0.614999999999988 | 1.004 |  |  |
| 0.615499999999988 | 1.003 |  |  |
| 0.615999999999987 | 1.003 |  |  |
| 0.616499999999987 | 1.002 |  |  |
| 0.616999999999987 | 1.001 |  |  |
| 0.617499999999987 | 1.001 |  |  |
| 0.617999999999987 | 1 |  |  |
| 0.618499999999987 | 0.999 |  |  |
| 0.618999999999987 | 0.999 |  |  |
| 0.619499999999987 | 0.998 |  |  |
| 0.619999999999987 | 0.997 |  |  |
| 0.620499999999987 | 0.997 |  |  |
| 0.620999999999987 | 0.996 |  |  |
| 0.621499999999987 | 0.995 |  |  |
| 0.621999999999987 | 0.994 |  |  |
| 0.622499999999987 | 0.994 |  |  |
| 0.622999999999987 | 0.993 |  |  |
| 0.623499999999987 | 0.992 |  |  |
| 0.623999999999987 | 0.992 |  |  |
| 0.624499999999987 | 0.991 |  |  |
| 0.624999999999986 | 0.99 |  |  |
| 0.625499999999986 | 0.99 |  |  |
| 0.625999999999986 | 0.989 |  |  |
| 0.626499999999986 | 0.988 |  |  |
| 0.626999999999986 | 0.987 |  |  |
| 0.627499999999986 | 0.987 |  |  |
| 0.627999999999986 | 0.986 |  |  |
| 0.628499999999986 | 0.985 |  |  |
| 0.628999999999986 | 0.985 |  |  |
| 0.629499999999986 | 0.984 |  |  |
| 0.629999999999986 | 0.983 |  |  |
| 0.630499999999986 | 0.982 |  |  |
| 0.630999999999986 | 0.982 |  |  |
| 0.631499999999986 | 0.981 |  |  |
| 0.631999999999986 | 0.98 |  |  |
| 0.632499999999986 | 0.979 |  |  |
| 0.632999999999986 | 0.979 |  |  |
| 0.633499999999986 | 0.978 |  |  |
| 0.633999999999985 | 0.977 |  |  |
| 0.634499999999985 | 0.976 |  |  |
| 0.634999999999985 | 0.976 |  |  |
| 0.635499999999985 | 0.975 |  |  |
| 0.635999999999985 | 0.974 |  |  |
| 0.636499999999985 | 0.974 |  |  |
| 0.636999999999985 | 0.973 |  |  |
| 0.637499999999985 | 0.972 |  |  |
| 0.637999999999985 | 0.971 |  |  |
| 0.638499999999985 | 0.971 |  |  |
| 0.638999999999985 | 0.97 |  |  |
| 0.639499999999985 | 0.969 |  |  |
| 0.639999999999985 | 0.968 |  |  |
| 0.640499999999985 | 0.968 |  |  |
| 0.640999999999985 | 0.967 |  |  |
| 0.641499999999985 | 0.966 |  |  |
| 0.641999999999985 | 0.965 |  |  |
| 0.642499999999985 | 0.964 |  |  |
| 0.642999999999984 | 0.964 |  |  |
| 0.643499999999984 | 0.963 |  |  |
| 0.643999999999984 | 0.962 |  |  |
| 0.644499999999984 | 0.961 |  |  |
| 0.644999999999984 | 0.961 |  |  |
| 0.645499999999984 | 0.96 |  |  |
| 0.645999999999984 | 0.959 |  |  |
| 0.646499999999984 | 0.958 |  |  |
| 0.646999999999984 | 0.958 |  |  |
| 0.647499999999984 | 0.957 |  |  |
| 0.647999999999984 | 0.956 |  |  |
| 0.648499999999984 | 0.955 |  |  |
| 0.648999999999984 | 0.954 |  |  |
| 0.649499999999984 | 0.954 |  |  |
| 0.649999999999984 | 0.953 |  |  |
| 0.650499999999984 | 0.952 |  |  |
| 0.650999999999984 | 0.951 |  |  |
| 0.651499999999984 | 0.951 |  |  |
| 0.651999999999983 | 0.95 |  |  |
| 0.652499999999983 | 0.949 |  |  |
| 0.652999999999983 | 0.948 |  |  |
| 0.653499999999983 | 0.947 |  |  |
| 0.653999999999983 | 0.947 |  |  |
| 0.654499999999983 | 0.946 |  |  |
| 0.654999999999983 | 0.945 |  |  |
| 0.655499999999983 | 0.944 |  |  |
| 0.655999999999983 | 0.943 |  |  |
| 0.656499999999983 | 0.943 |  |  |
| 0.656999999999983 | 0.942 |  |  |
| 0.657499999999983 | 0.941 |  |  |
| 0.657999999999983 | 0.94 |  |  |
| 0.658499999999983 | 0.939 |  |  |
| 0.658999999999983 | 0.939 |  |  |
| 0.659499999999983 | 0.938 |  |  |
| 0.659999999999983 | 0.937 |  |  |
| 0.660499999999983 | 0.936 |  |  |
| 0.660999999999983 | 0.935 |  |  |
| 0.661499999999982 | 0.934 |  |  |
| 0.661999999999982 | 0.934 |  |  |
| 0.662499999999982 | 0.933 |  |  |
| 0.662999999999982 | 0.932 |  |  |
| 0.663499999999982 | 0.931 |  |  |
| 0.663999999999982 | 0.93 |  |  |
| 0.664499999999982 | 0.93 |  |  |
| 0.664999999999982 | 0.929 |  |  |
| 0.665499999999982 | 0.928 |  |  |
| 0.665999999999982 | 0.927 |  |  |
| 0.666499999999982 | 0.926 |  |  |
| 0.666999999999982 | 0.925 |  |  |
| 0.667499999999982 | 0.925 |  |  |
| 0.667999999999982 | 0.924 |  |  |
| 0.668499999999982 | 0.923 |  |  |
| 0.668999999999982 | 0.922 |  |  |
| 0.669499999999982 | 0.921 |  |  |
| 0.669999999999982 | 0.92 |  |  |
| 0.670499999999981 | 0.919 |  |  |
| 0.670999999999981 | 0.919 |  |  |
| 0.671499999999981 | 0.918 |  |  |
| 0.671999999999981 | 0.917 |  |  |
| 0.672499999999981 | 0.916 |  |  |
| 0.672999999999981 | 0.915 |  |  |
| 0.673499999999981 | 0.914 |  |  |
| 0.673999999999981 | 0.914 |  |  |
| 0.674499999999981 | 0.913 |  |  |
| 0.674999999999981 | 0.912 |  |  |
| 0.675499999999981 | 0.911 |  |  |
| 0.675999999999981 | 0.91 |  |  |
| 0.676499999999981 | 0.909 |  |  |
| 0.676999999999981 | 0.908 |  |  |
| 0.677499999999981 | 0.908 |  |  |
| 0.677999999999981 | 0.907 |  |  |
| 0.678499999999981 | 0.906 |  |  |
| 0.678999999999981 | 0.905 |  |  |
| 0.67949999999998 | 0.904 |  |  |
| 0.67999999999998 | 0.903 |  |  |
| 0.68049999999998 | 0.902 |  |  |
| 0.68099999999998 | 0.901 |  |  |
| 0.68149999999998 | 0.901 |  |  |
| 0.68199999999998 | 0.9 |  |  |
| 0.68249999999998 | 0.899 |  |  |
| 0.68299999999998 | 0.898 |  |  |
| 0.68349999999998 | 0.897 |  |  |
| 0.68399999999998 | 0.896 |  |  |
| 0.68449999999998 | 0.895 |  |  |
| 0.68499999999998 | 0.894 |  |  |
| 0.68549999999998 | 0.893 |  |  |
| 0.68599999999998 | 0.893 |  |  |
| 0.68649999999998 | 0.892 |  |  |
| 0.68699999999998 | 0.891 |  |  |
| 0.68749999999998 | 0.89 |  |  |
| 0.68799999999998 | 0.889 |  |  |
| 0.688499999999979 | 0.888 |  |  |
| 0.688999999999979 | 0.887 |  |  |
| 0.689499999999979 | 0.886 |  |  |
| 0.689999999999979 | 0.885 |  |  |
| 0.690499999999979 | 0.884 |  |  |
| 0.690999999999979 | 0.884 |  |  |
| 0.691499999999979 | 0.883 |  |  |
| 0.691999999999979 | 0.882 |  |  |
| 0.692499999999979 | 0.881 |  |  |
| 0.692999999999979 | 0.88 |  |  |
| 0.693499999999979 | 0.879 |  |  |
| 0.693999999999979 | 0.878 |  |  |
| 0.694499999999979 | 0.877 |  |  |
| 0.694999999999979 | 0.876 |  |  |
| 0.695499999999979 | 0.875 |  |  |
| 0.695999999999979 | 0.874 |  |  |
| 0.696499999999979 | 0.874 |  |  |
| 0.696999999999979 | 0.873 |  |  |
| 0.697499999999978 | 0.872 |  |  |
| 0.697999999999978 | 0.871 |  |  |
| 0.698499999999978 | 0.87 |  |  |
| 0.698999999999978 | 0.869 |  |  |
| 0.699499999999978 | 0.868 |  |  |
| 0.699999999999978 | 0.867 |  |  |
| 0.700499999999978 | 0.866 |  |  |
| 0.700999999999978 | 0.865 |  |  |
| 0.701499999999978 | 0.864 |  |  |
| 0.701999999999978 | 0.863 |  |  |
| 0.702499999999978 | 0.862 |  |  |
| 0.702999999999978 | 0.861 |  |  |
| 0.703499999999978 | 0.86 |  |  |
| 0.703999999999978 | 0.859 |  |  |
| 0.704499999999978 | 0.859 |  |  |
| 0.704999999999978 | 0.858 |  |  |
| 0.705499999999978 | 0.857 |  |  |
| 0.705999999999978 | 0.856 |  |  |
| 0.706499999999978 | 0.855 |  |  |
| 0.706999999999977 | 0.854 |  |  |
| 0.707499999999977 | 0.853 |  |  |
| 0.707999999999977 | 0.852 |  |  |
| 0.708499999999977 | 0.851 |  |  |
| 0.708999999999977 | 0.85 |  |  |
| 0.709499999999977 | 0.849 |  |  |
| 0.709999999999977 | 0.848 |  |  |
| 0.710499999999977 | 0.847 |  |  |
| 0.710999999999977 | 0.846 |  |  |
| 0.711499999999977 | 0.845 |  |  |
| 0.711999999999977 | 0.844 |  |  |
| 0.712499999999977 | 0.843 |  |  |
| 0.712999999999977 | 0.842 |  |  |
| 0.713499999999977 | 0.841 |  |  |
| 0.713999999999977 | 0.84 |  |  |
| 0.714499999999977 | 0.839 |  |  |
| 0.714999999999977 | 0.838 |  |  |
| 0.715499999999977 | 0.837 |  |  |
| 0.715999999999976 | 0.836 |  |  |
| 0.716499999999976 | 0.835 |  |  |
| 0.716999999999976 | 0.834 |  |  |
| 0.717499999999976 | 0.833 |  |  |
| 0.717999999999976 | 0.832 |  |  |
| 0.718499999999976 | 0.831 |  |  |
| 0.718999999999976 | 0.83 |  |  |
| 0.719499999999976 | 0.829 |  |  |
| 0.719999999999976 | 0.828 |  |  |
| 0.720499999999976 | 0.827 |  |  |
| 0.720999999999976 | 0.826 |  |  |
| 0.721499999999976 | 0.825 |  |  |
| 0.721999999999976 | 0.824 |  |  |
| 0.722499999999976 | 0.823 |  |  |
| 0.722999999999976 | 0.822 |  |  |
| 0.723499999999976 | 0.821 |  |  |
| 0.723999999999976 | 0.82 |  |  |
| 0.724499999999976 | 0.819 |  |  |
| 0.724999999999975 | 0.818 |  |  |
| 0.725499999999975 | 0.817 |  |  |
| 0.725999999999975 | 0.816 |  |  |
| 0.726499999999975 | 0.815 |  |  |
| 0.726999999999975 | 0.814 |  |  |
| 0.727499999999975 | 0.813 |  |  |
| 0.727999999999975 | 0.812 |  |  |
| 0.728499999999975 | 0.811 |  |  |
| 0.728999999999975 | 0.81 |  |  |
| 0.729499999999975 | 0.809 |  |  |
| 0.729999999999975 | 0.808 |  |  |
| 0.730499999999975 | 0.807 |  |  |
| 0.730999999999975 | 0.806 |  |  |
| 0.731499999999975 | 0.805 |  |  |
| 0.731999999999975 | 0.804 |  |  |
| 0.732499999999975 | 0.803 |  |  |
| 0.732999999999975 | 0.802 |  |  |
| 0.733499999999975 | 0.801 |  |  |
| 0.733999999999974 | 0.8 |  |  |
| 0.734499999999974 | 0.799 |  |  |
| 0.734999999999974 | 0.798 |  |  |
| 0.735499999999974 | 0.797 |  |  |
| 0.735999999999974 | 0.796 |  |  |
| 0.736499999999974 | 0.795 |  |  |
| 0.736999999999974 | 0.794 |  |  |
| 0.737499999999974 | 0.792 |  |  |
| 0.737999999999974 | 0.791 |  |  |
| 0.738499999999974 | 0.79 |  |  |
| 0.738999999999974 | 0.789 |  |  |
| 0.739499999999974 | 0.788 |  |  |
| 0.739999999999974 | 0.787 |  |  |
| 0.740499999999974 | 0.786 |  |  |
| 0.740999999999974 | 0.785 |  |  |
| 0.741499999999974 | 0.784 |  |  |
| 0.741999999999974 | 0.783 |  |  |
| 0.742499999999974 | 0.782 |  |  |
| 0.742999999999973 | 0.781 |  |  |
| 0.743499999999973 | 0.78 |  |  |
| 0.743999999999973 | 0.779 |  |  |
| 0.744499999999973 | 0.778 |  |  |
| 0.744999999999973 | 0.776 |  |  |
| 0.745499999999973 | 0.775 |  |  |
| 0.745999999999973 | 0.774 |  |  |
| 0.746499999999973 | 0.773 |  |  |
| 0.746999999999973 | 0.772 |  |  |
| 0.747499999999973 | 0.771 |  |  |
| 0.747999999999973 | 0.77 |  |  |
| 0.748499999999973 | 0.769 |  |  |
| 0.748999999999973 | 0.768 |  |  |
| 0.749499999999973 | 0.767 |  |  |
| 0.749999999999973 | 0.766 |  |  |
| 0.750499999999973 | 0.765 |  |  |
| 0.750999999999973 | 0.763 |  |  |
| 0.751499999999973 | 0.762 |  |  |
| 0.751999999999973 | 0.761 |  |  |
| 0.752499999999972 | 0.76 |  |  |
| 0.752999999999972 | 0.759 |  |  |
| 0.753499999999972 | 0.758 |  |  |
| 0.753999999999972 | 0.757 |  |  |
| 0.754499999999972 | 0.756 |  |  |
| 0.754999999999972 | 0.755 |  |  |
| 0.755499999999972 | 0.753 |  |  |
| 0.755999999999972 | 0.752 |  |  |
| 0.756499999999972 | 0.751 |  |  |
| 0.756999999999972 | 0.75 |  |  |
| 0.757499999999972 | 0.749 |  |  |
| 0.757999999999972 | 0.748 |  |  |
| 0.758499999999972 | 0.747 |  |  |
| 0.758999999999972 | 0.746 |  |  |
| 0.759499999999972 | 0.745 |  |  |
| 0.759999999999972 | 0.743 |  |  |
| 0.760499999999972 | 0.742 |  |  |
| 0.760999999999972 | 0.741 |  |  |
| 0.761499999999971 | 0.74 |  |  |
| 0.761999999999971 | 0.739 |  |  |
| 0.762499999999971 | 0.738 |  |  |
| 0.762999999999971 | 0.737 |  |  |
| 0.763499999999971 | 0.735 |  |  |
| 0.763999999999971 | 0.734 |  |  |
| 0.764499999999971 | 0.733 |  |  |
| 0.764999999999971 | 0.732 |  |  |
| 0.765499999999971 | 0.731 |  |  |
| 0.765999999999971 | 0.73 |  |  |
| 0.766499999999971 | 0.729 |  |  |
| 0.766999999999971 | 0.727 |  |  |
| 0.767499999999971 | 0.726 |  |  |
| 0.767999999999971 | 0.725 |  |  |
| 0.768499999999971 | 0.724 |  |  |
| 0.768999999999971 | 0.723 |  |  |
| 0.769499999999971 | 0.722 |  |  |
| 0.769999999999971 | 0.721 |  |  |
| 0.77049999999997 | 0.719 |  |  |
| 0.77099999999997 | 0.718 |  |  |
| 0.77149999999997 | 0.717 |  |  |
| 0.77199999999997 | 0.716 |  |  |
| 0.77249999999997 | 0.715 |  |  |
| 0.77299999999997 | 0.714 |  |  |
| 0.77349999999997 | 0.712 |  |  |
| 0.77399999999997 | 0.711 |  |  |
| 0.77449999999997 | 0.71 |  |  |
| 0.77499999999997 | 0.709 |  |  |
| 0.77549999999997 | 0.708 |  |  |
| 0.77599999999997 | 0.707 |  |  |
| 0.77649999999997 | 0.705 |  |  |
| 0.77699999999997 | 0.704 |  |  |
| 0.77749999999997 | 0.703 |  |  |
| 0.77799999999997 | 0.702 |  |  |
| 0.77849999999997 | 0.701 |  |  |
| 0.77899999999997 | 0.699 |  |  |
| 0.779499999999969 | 0.698 |  |  |
| 0.779999999999969 | 0.697 |  |  |
| 0.780499999999969 | 0.696 |  |  |
| 0.780999999999969 | 0.695 |  |  |
| 0.781499999999969 | 0.693 |  |  |
| 0.781999999999969 | 0.692 |  |  |
| 0.782499999999969 | 0.691 |  |  |
| 0.782999999999969 | 0.69 |  |  |
| 0.783499999999969 | 0.689 |  |  |
| 0.783999999999969 | 0.687 |  |  |
| 0.784499999999969 | 0.686 |  |  |
| 0.784999999999969 | 0.685 |  |  |
| 0.785499999999969 | 0.684 |  |  |
| 0.785999999999969 | 0.683 |  |  |
| 0.786499999999969 | 0.681 |  |  |
| 0.786999999999969 | 0.68 |  |  |
| 0.787499999999969 | 0.679 |  |  |
| 0.787999999999969 | 0.678 |  |  |
| 0.788499999999968 | 0.677 |  |  |
| 0.788999999999968 | 0.675 |  |  |
| 0.789499999999968 | 0.674 |  |  |
| 0.789999999999968 | 0.673 |  |  |
| 0.790499999999968 | 0.672 |  |  |
| 0.790999999999968 | 0.67 |  |  |
| 0.791499999999968 | 0.669 |  |  |
| 0.791999999999968 | 0.668 |  |  |
| 0.792499999999968 | 0.667 |  |  |
| 0.792999999999968 | 0.665 |  |  |
| 0.793499999999968 | 0.664 |  |  |
| 0.793999999999968 | 0.663 |  |  |
| 0.794499999999968 | 0.662 |  |  |
| 0.794999999999968 | 0.661 |  |  |
| 0.795499999999968 | 0.659 |  |  |
| 0.795999999999968 | 0.658 |  |  |
| 0.796499999999968 | 0.657 |  |  |
| 0.796999999999968 | 0.656 |  |  |
| 0.797499999999967 | 0.654 |  |  |
| 0.797999999999967 | 0.653 |  |  |
| 0.798499999999967 | 0.652 |  |  |
| 0.798999999999967 | 0.651 |  |  |
| 0.799499999999967 | 0.649 |  |  |
| 0.799999999999967 | 0.648 |  |  |
| 0.800499999999967 | 0.647 |  |  |
| 0.800999999999967 | 0.645 |  |  |
| 0.801499999999967 | 0.644 |  |  |
| 0.801999999999967 | 0.643 |  |  |
| 0.802499999999967 | 0.642 |  |  |
| 0.802999999999967 | 0.64 |  |  |
| 0.803499999999967 | 0.639 |  |  |
| 0.803999999999967 | 0.638 |  |  |
| 0.804499999999967 | 0.637 |  |  |
| 0.804999999999967 | 0.635 |  |  |
| 0.805499999999967 | 0.634 |  |  |
| 0.805999999999967 | 0.633 |  |  |
| 0.806499999999967 | 0.631 |  |  |
| 0.806999999999966 | 0.63 |  |  |
| 0.807499999999966 | 0.629 |  |  |
| 0.807999999999966 | 0.628 |  |  |
| 0.808499999999966 | 0.626 |  |  |
| 0.808999999999966 | 0.625 |  |  |
| 0.809499999999966 | 0.624 |  |  |
| 0.809999999999966 | 0.622 |  |  |
| 0.810499999999966 | 0.621 |  |  |
| 0.810999999999966 | 0.62 |  |  |
| 0.811499999999966 | 0.619 |  |  |
| 0.811999999999966 | 0.617 |  |  |
| 0.812499999999966 | 0.616 |  |  |
| 0.812999999999966 | 0.615 |  |  |
| 0.813499999999966 | 0.613 |  |  |
| 0.813999999999966 | 0.612 |  |  |
| 0.814499999999966 | 0.611 |  |  |
| 0.814999999999966 | 0.609 |  |  |
| 0.815499999999966 | 0.608 |  |  |
| 0.815999999999965 | 0.607 |  |  |
| 0.816499999999965 | 0.605 |  |  |
| 0.816999999999965 | 0.604 |  |  |
| 0.817499999999965 | 0.603 |  |  |
| 0.817999999999965 | 0.602 |  |  |
| 0.818499999999965 | 0.6 |  |  |
| 0.818999999999965 | 0.599 |  |  |
| 0.819499999999965 | 0.598 |  |  |
| 0.819999999999965 | 0.596 |  |  |
| 0.820499999999965 | 0.595 |  |  |
| 0.820999999999965 | 0.594 |  |  |
| 0.821499999999965 | 0.592 |  |  |
| 0.821999999999965 | 0.591 |  |  |
| 0.822499999999965 | 0.59 |  |  |
| 0.822999999999965 | 0.588 |  |  |
| 0.823499999999965 | 0.587 |  |  |
| 0.823999999999965 | 0.586 |  |  |
| 0.824499999999965 | 0.584 |  |  |
| 0.824999999999964 | 0.583 |  |  |
| 0.825499999999964 | 0.582 |  |  |
| 0.825999999999964 | 0.58 |  |  |
| 0.826499999999964 | 0.579 |  |  |
| 0.826999999999964 | 0.577 |  |  |
| 0.827499999999964 | 0.576 |  |  |
| 0.827999999999964 | 0.575 |  |  |
| 0.828499999999964 | 0.573 |  |  |
| 0.828999999999964 | 0.572 |  |  |
| 0.829499999999964 | 0.571 |  |  |
| 0.829999999999964 | 0.569 |  |  |
| 0.830499999999964 | 0.568 |  |  |
| 0.830999999999964 | 0.567 |  |  |
| 0.831499999999964 | 0.565 |  |  |
| 0.831999999999964 | 0.564 |  |  |
| 0.832499999999964 | 0.562 |  |  |
| 0.832999999999964 | 0.561 |  |  |
| 0.833499999999964 | 0.56 |  |  |
| 0.833999999999963 | 0.558 |  |  |
| 0.834499999999963 | 0.557 |  |  |
| 0.834999999999963 | 0.556 |  |  |
| 0.835499999999963 | 0.554 |  |  |
| 0.835999999999963 | 0.553 |  |  |
| 0.836499999999963 | 0.551 |  |  |
| 0.836999999999963 | 0.55 |  |  |
| 0.837499999999963 | 0.549 |  |  |
| 0.837999999999963 | 0.547 |  |  |
| 0.838499999999963 | 0.546 |  |  |
| 0.838999999999963 | 0.544 |  |  |
| 0.839499999999963 | 0.543 |  |  |
| 0.839999999999963 | 0.542 |  |  |
| 0.840499999999963 | 0.54 |  |  |
| 0.840999999999963 | 0.539 |  |  |
| 0.841499999999963 | 0.537 |  |  |
| 0.841999999999963 | 0.536 |  |  |
| 0.842499999999963 | 0.535 |  |  |
| 0.842999999999963 | 0.533 |  |  |
| 0.843499999999962 | 0.532 |  |  |
| 0.843999999999962 | 0.53 |  |  |
| 0.844499999999962 | 0.529 |  |  |
| 0.844999999999962 | 0.528 |  |  |
| 0.845499999999962 | 0.526 |  |  |
| 0.845999999999962 | 0.525 |  |  |
| 0.846499999999962 | 0.523 |  |  |
| 0.846999999999962 | 0.522 |  |  |
| 0.847499999999962 | 0.521 |  |  |
| 0.847999999999962 | 0.519 |  |  |
| 0.848499999999962 | 0.518 |  |  |
| 0.848999999999962 | 0.516 |  |  |
| 0.849499999999962 | 0.515 |  |  |
| 0.849999999999962 | 0.513 |  |  |
| 0.850499999999962 | 0.512 |  |  |
| 0.850999999999962 | 0.511 |  |  |
| 0.851499999999962 | 0.509 |  |  |
| 0.851999999999962 | 0.508 |  |  |
| 0.852499999999961 | 0.506 |  |  |
| 0.852999999999961 | 0.505 |  |  |
| 0.853499999999961 | 0.503 |  |  |
| 0.853999999999961 | 0.502 |  |  |
| 0.854499999999961 | 0.5 |  |  |
| 0.854999999999961 | 0.499 |  |  |
| 0.855499999999961 | 0.497 |  |  |
| 0.855999999999961 | 0.496 |  |  |
| 0.856499999999961 | 0.495 |  |  |
| 0.856999999999961 | 0.493 |  |  |
| 0.857499999999961 | 0.492 |  |  |
| 0.857999999999961 | 0.49 |  |  |
| 0.858499999999961 | 0.489 |  |  |
| 0.858999999999961 | 0.487 |  |  |
| 0.859499999999961 | 0.486 |  |  |
| 0.859999999999961 | 0.484 |  |  |
| 0.860499999999961 | 0.483 |  |  |
| 0.860999999999961 | 0.481 |  |  |
| 0.86149999999996 | 0.48 |  |  |
| 0.86199999999996 | 0.478 |  |  |
| 0.86249999999996 | 0.477 |  |  |
| 0.86299999999996 | 0.475 |  |  |
| 0.86349999999996 | 0.474 |  |  |
| 0.86399999999996 | 0.473 |  |  |
| 0.86449999999996 | 0.471 |  |  |
| 0.86499999999996 | 0.47 |  |  |
| 0.86549999999996 | 0.468 |  |  |
| 0.86599999999996 | 0.467 |  |  |
| 0.86649999999996 | 0.465 |  |  |
| 0.86699999999996 | 0.464 |  |  |
| 0.86749999999996 | 0.462 |  |  |
| 0.86799999999996 | 0.461 |  |  |
| 0.86849999999996 | 0.459 |  |  |
| 0.86899999999996 | 0.458 |  |  |
| 0.86949999999996 | 0.456 |  |  |
| 0.86999999999996 | 0.455 |  |  |
| 0.870499999999959 | 0.453 |  |  |
| 0.870999999999959 | 0.452 |  |  |
| 0.871499999999959 | 0.45 |  |  |
| 0.871999999999959 | 0.449 |  |  |
| 0.872499999999959 | 0.447 |  |  |
| 0.872999999999959 | 0.446 |  |  |
| 0.873499999999959 | 0.444 |  |  |
| 0.873999999999959 | 0.442 |  |  |
| 0.874499999999959 | 0.441 |  |  |
| 0.874999999999959 | 0.439 |  |  |
| 0.875499999999959 | 0.438 |  |  |
| 0.875999999999959 | 0.436 |  |  |
| 0.876499999999959 | 0.435 |  |  |
| 0.876999999999959 | 0.433 |  |  |
| 0.877499999999959 | 0.432 |  |  |
| 0.877999999999959 | 0.43 |  |  |
| 0.878499999999959 | 0.429 |  |  |
| 0.878999999999959 | 0.427 |  |  |
| 0.879499999999958 | 0.426 |  |  |
| 0.879999999999958 | 0.424 |  |  |
| 0.880499999999958 | 0.423 |  |  |
| 0.880999999999958 | 0.421 |  |  |
| 0.881499999999958 | 0.419 |  |  |
| 0.881999999999958 | 0.418 |  |  |
| 0.882499999999958 | 0.416 |  |  |
| 0.882999999999958 | 0.415 |  |  |
| 0.883499999999958 | 0.413 |  |  |
| 0.883999999999958 | 0.412 |  |  |
| 0.884499999999958 | 0.41 |  |  |
| 0.884999999999958 | 0.409 |  |  |
| 0.885499999999958 | 0.407 |  |  |
| 0.885999999999958 | 0.405 |  |  |
| 0.886499999999958 | 0.404 |  |  |
| 0.886999999999958 | 0.402 |  |  |
| 0.887499999999958 | 0.401 |  |  |
| 0.887999999999958 | 0.399 |  |  |
| 0.888499999999957 | 0.398 |  |  |
| 0.888999999999957 | 0.396 |  |  |
| 0.889499999999957 | 0.395 |  |  |
| 0.889999999999957 | 0.393 |  |  |
| 0.890499999999957 | 0.391 |  |  |
| 0.890999999999957 | 0.39 |  |  |
| 0.891499999999957 | 0.388 |  |  |
| 0.891999999999957 | 0.387 |  |  |
| 0.892499999999957 | 0.385 |  |  |
| 0.892999999999957 | 0.383 |  |  |
| 0.893499999999957 | 0.382 |  |  |
| 0.893999999999957 | 0.38 |  |  |
| 0.894499999999957 | 0.379 |  |  |
| 0.894999999999957 | 0.377 |  |  |
| 0.895499999999957 | 0.375 |  |  |
| 0.895999999999957 | 0.374 |  |  |
| 0.896499999999957 | 0.372 |  |  |
| 0.896999999999957 | 0.371 |  |  |
| 0.897499999999956 | 0.369 |  |  |
| 0.897999999999956 | 0.367 |  |  |
| 0.898499999999956 | 0.366 |  |  |
| 0.898999999999956 | 0.364 |  |  |
| 0.899499999999956 | 0.363 |  |  |
| 0.899999999999956 | 0.361 |  |  |
| 0.900499999999956 | 0.359 |  |  |
| 0.900999999999956 | 0.358 |  |  |
| 0.901499999999956 | 0.356 |  |  |
| 0.901999999999956 | 0.355 |  |  |
| 0.902499999999956 | 0.353 |  |  |
| 0.902999999999956 | 0.351 |  |  |
| 0.903499999999956 | 0.35 |  |  |
| 0.903999999999956 | 0.348 |  |  |
| 0.904499999999956 | 0.346 |  |  |
| 0.904999999999956 | 0.345 |  |  |
| 0.905499999999956 | 0.343 |  |  |
| 0.905999999999956 | 0.341 |  |  |
| 0.906499999999956 | 0.34 |  |  |
| 0.906999999999955 | 0.338 |  |  |
| 0.907499999999955 | 0.337 |  |  |
| 0.907999999999955 | 0.335 |  |  |
| 0.908499999999955 | 0.333 |  |  |
| 0.908999999999955 | 0.332 |  |  |
| 0.909499999999955 | 0.33 |  |  |
| 0.909999999999955 | 0.328 |  |  |
| 0.910499999999955 | 0.327 |  |  |
| 0.910999999999955 | 0.325 |  |  |
| 0.911499999999955 | 0.323 |  |  |
| 0.911999999999955 | 0.322 |  |  |
| 0.912499999999955 | 0.32 |  |  |
| 0.912999999999955 | 0.318 |  |  |
| 0.913499999999955 | 0.317 |  |  |
| 0.913999999999955 | 0.315 |  |  |
| 0.914499999999955 | 0.313 |  |  |
| 0.914999999999955 | 0.312 |  |  |
| 0.915499999999955 | 0.31 |  |  |
| 0.915999999999954 | 0.308 |  |  |
| 0.916499999999954 | 0.307 |  |  |
| 0.916999999999954 | 0.305 |  |  |
| 0.917499999999954 | 0.303 |  |  |
| 0.917999999999954 | 0.302 |  |  |
| 0.918499999999954 | 0.3 |  |  |
| 0.918999999999954 | 0.298 |  |  |
| 0.919499999999954 | 0.297 |  |  |
| 0.919999999999954 | 0.295 |  |  |
| 0.920499999999954 | 0.293 |  |  |
| 0.920999999999954 | 0.292 |  |  |
| 0.921499999999954 | 0.29 |  |  |
| 0.921999999999954 | 0.288 |  |  |
| 0.922499999999954 | 0.286 |  |  |
| 0.922999999999954 | 0.285 |  |  |
| 0.923499999999954 | 0.283 |  |  |
| 0.923999999999954 | 0.281 |  |  |
| 0.924499999999954 | 0.28 |  |  |
| 0.924999999999953 | 0.278 |  |  |
| 0.925499999999953 | 0.276 |  |  |
| 0.925999999999953 | 0.275 |  |  |
| 0.926499999999953 | 0.273 |  |  |
| 0.926999999999953 | 0.271 |  |  |
| 0.927499999999953 | 0.269 |  |  |
| 0.927999999999953 | 0.268 |  |  |
| 0.928499999999953 | 0.266 |  |  |
| 0.928999999999953 | 0.264 |  |  |
| 0.929499999999953 | 0.262 |  |  |
| 0.929999999999953 | 0.261 |  |  |
| 0.930499999999953 | 0.259 |  |  |
| 0.930999999999953 | 0.257 |  |  |
| 0.931499999999953 | 0.256 |  |  |
| 0.931999999999953 | 0.254 |  |  |
| 0.932499999999953 | 0.252 |  |  |
| 0.932999999999953 | 0.25 |  |  |
| 0.933499999999953 | 0.249 |  |  |
| 0.933999999999953 | 0.247 |  |  |
| 0.934499999999952 | 0.245 |  |  |
| 0.934999999999952 | 0.243 |  |  |
| 0.935499999999952 | 0.242 |  |  |
| 0.935999999999952 | 0.24 |  |  |
| 0.936499999999952 | 0.238 |  |  |
| 0.936999999999952 | 0.236 |  |  |
| 0.937499999999952 | 0.235 |  |  |
| 0.937999999999952 | 0.233 |  |  |
| 0.938499999999952 | 0.231 |  |  |
| 0.938999999999952 | 0.229 |  |  |
| 0.939499999999952 | 0.228 |  |  |
| 0.939999999999952 | 0.226 |  |  |
| 0.940499999999952 | 0.224 |  |  |
| 0.940999999999952 | 0.222 |  |  |
| 0.941499999999952 | 0.221 |  |  |
| 0.941999999999952 | 0.219 |  |  |
| 0.942499999999952 | 0.217 |  |  |
| 0.942999999999952 | 0.215 |  |  |
| 0.943499999999951 | 0.213 |  |  |
| 0.943999999999951 | 0.212 |  |  |
| 0.944499999999951 | 0.21 |  |  |
| 0.944999999999951 | 0.208 |  |  |
| 0.945499999999951 | 0.206 |  |  |
| 0.945999999999951 | 0.204 |  |  |
| 0.946499999999951 | 0.203 |  |  |
| 0.946999999999951 | 0.201 |  |  |
| 0.947499999999951 | 0.199 |  |  |
| 0.947999999999951 | 0.197 |  |  |
| 0.948499999999951 | 0.196 |  |  |
| 0.948999999999951 | 0.194 |  |  |
| 0.949499999999951 | 0.192 |  |  |
| 0.949999999999951 | 0.19 |  |  |
| 0.950499999999951 | 0.188 |  |  |
| 0.950999999999951 | 0.187 |  |  |
| 0.951499999999951 | 0.185 |  |  |
| 0.951999999999951 | 0.183 |  |  |
| 0.95249999999995 | 0.181 |  |  |
| 0.95299999999995 | 0.179 |  |  |
| 0.95349999999995 | 0.177 |  |  |
| 0.95399999999995 | 0.176 |  |  |
| 0.95449999999995 | 0.174 |  |  |
| 0.95499999999995 | 0.172 |  |  |
| 0.95549999999995 | 0.17 |  |  |
| 0.95599999999995 | 0.168 |  |  |
| 0.95649999999995 | 0.167 |  |  |
| 0.95699999999995 | 0.165 |  |  |
| 0.95749999999995 | 0.163 |  |  |
| 0.95799999999995 | 0.161 |  |  |
| 0.95849999999995 | 0.159 |  |  |
| 0.95899999999995 | 0.157 |  |  |
| 0.95949999999995 | 0.156 |  |  |
| 0.95999999999995 | 0.154 |  |  |
| 0.96049999999995 | 0.152 |  |  |
| 0.96099999999995 | 0.15 |  |  |
| 0.961499999999949 | 0.148 |  |  |
| 0.961999999999949 | 0.146 |  |  |
| 0.962499999999949 | 0.144 |  |  |
| 0.962999999999949 | 0.143 |  |  |
| 0.963499999999949 | 0.141 |  |  |
| 0.963999999999949 | 0.139 |  |  |
| 0.964499999999949 | 0.137 |  |  |
| 0.964999999999949 | 0.135 |  |  |
| 0.965499999999949 | 0.133 |  |  |
| 0.965999999999949 | 0.131 |  |  |
| 0.966499999999949 | 0.13 |  |  |
| 0.966999999999949 | 0.128 |  |  |
| 0.967499999999949 | 0.126 |  |  |
| 0.967999999999949 | 0.124 |  |  |
| 0.968499999999949 | 0.122 |  |  |
| 0.968999999999949 | 0.12 |  |  |
| 0.969499999999949 | 0.118 |  |  |
| 0.969999999999949 | 0.116 |  |  |
| 0.970499999999948 | 0.115 |  |  |
| 0.970999999999948 | 0.113 |  |  |
| 0.971499999999948 | 0.111 |  |  |
| 0.971999999999948 | 0.109 |  |  |
| 0.972499999999948 | 0.107 |  |  |
| 0.972999999999948 | 0.105 |  |  |
| 0.973499999999948 | 0.103 |  |  |
| 0.973999999999948 | 0.101 |  |  |
| 0.974499999999948 | 0.099 |  |  |
| 0.974999999999948 | 0.098 |  |  |
| 0.975499999999948 | 0.096 |  |  |
| 0.975999999999948 | 0.094 |  |  |
| 0.976499999999948 | 0.092 |  |  |
| 0.976999999999948 | 0.09 |  |  |
| 0.977499999999948 | 0.088 |  |  |
| 0.977999999999948 | 0.086 |  |  |
| 0.978499999999948 | 0.084 |  |  |
| 0.978999999999948 | 0.082 |  |  |
| 0.979499999999947 | 0.08 |  |  |
| 0.979999999999947 | 0.078 |  |  |
| 0.980499999999947 | 0.076 |  |  |
| 0.980999999999947 | 0.075 |  |  |
| 0.981499999999947 | 0.073 |  |  |
| 0.981999999999947 | 0.071 |  |  |
| 0.982499999999947 | 0.069 |  |  |
| 0.982999999999947 | 0.067 |  |  |
| 0.983499999999947 | 0.065 |  |  |
| 0.983999999999947 | 0.063 |  |  |
| 0.984499999999947 | 0.061 |  |  |
| 0.984999999999947 | 0.059 |  |  |
| 0.985499999999947 | 0.057 |  |  |
| 0.985999999999947 | 0.055 |  |  |
| 0.986499999999947 | 0.053 |  |  |
| 0.986999999999947 | 0.051 |  |  |
| 0.987499999999947 | 0.049 |  |  |
| 0.987999999999947 | 0.047 |  |  |
| 0.988499999999946 | 0.045 |  |  |
| 0.988999999999946 | 0.044 |  |  |
| 0.989499999999946 | 0.042 |  |  |
| 0.989999999999946 | 0.04 |  |  |
| 0.990499999999946 | 0.038 |  |  |
| 0.990999999999946 | 0.036 |  |  |
| 0.991499999999946 | 0.034 |  |  |
| 0.991999999999946 | 0.032 |  |  |
| 0.992499999999946 | 0.03 |  |  |
| 0.992999999999946 | 0.028 |  |  |
| 0.993499999999946 | 0.026 |  |  |
| 0.993999999999946 | 0.024 |  |  |
| 0.994499999999946 | 0.022 |  |  |
| 0.994999999999946 | 0.02 |  |  |
| 0.995499999999946 | 0.018 |  |  |
| 0.995999999999946 | 0.016 |  |  |
| 0.996499999999946 | 0.014 |  |  |
| 0.996999999999946 | 0.012 |  |  |
| 0.997499999999945 | 0.01 |  |  |
| 0.997999999999945 | 0.008 |  |  |
| 0.998499999999945 | 0.006 |  |  |
| 0.998999999999945 | 0.004 |  |  |
| 0.999499999999945 | 0.002 |  |  |
| 0.999999999999945 | 0 |  |  |